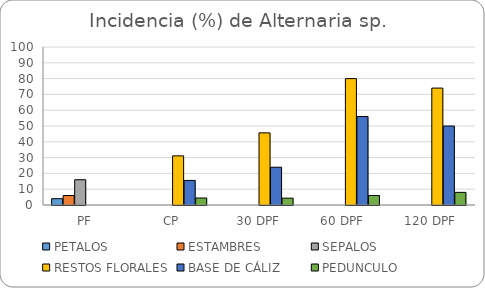
| Category | PETALOS  | ESTAMBRES | SEPALOS | RESTOS FLORALES | BASE DE CÁLIZ | PEDUNCULO |
|---|---|---|---|---|---|---|
| PF | 4 | 6 | 16 | 0 | 0 | 0 |
| CP | 0 | 0 | 0 | 31.11 | 15.55 | 4.44 |
| 30 DPF | 0 | 0 | 0 | 45.65 | 23.91 | 4.34 |
| 60 DPF  | 0 | 0 | 0 | 80 | 56 | 6 |
| 120 DPF | 0 | 0 | 0 | 74 | 50 | 8 |